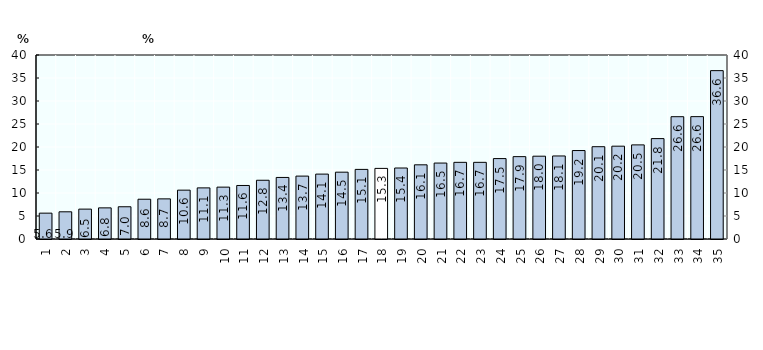
| Category |   2013 (or latest year) |
|---|---|
| 0 | 5.619 |
| 1 | 5.913 |
| 2 | 6.495 |
| 3 | 6.769 |
| 4 | 7.008 |
| 5 | 8.648 |
| 6 | 8.724 |
| 7 | 10.62 |
| 8 | 11.111 |
| 9 | 11.274 |
| 10 | 11.634 |
| 11 | 12.77 |
| 12 | 13.38 |
| 13 | 13.673 |
| 14 | 14.109 |
| 15 | 14.527 |
| 16 | 15.13 |
| 17 | 15.347 |
| 18 | 15.433 |
| 19 | 16.126 |
| 20 | 16.509 |
| 21 | 16.667 |
| 22 | 16.667 |
| 23 | 17.482 |
| 24 | 17.907 |
| 25 | 18 |
| 26 | 18.053 |
| 27 | 19.229 |
| 28 | 20.065 |
| 29 | 20.178 |
| 30 | 20.46 |
| 31 | 21.827 |
| 32 | 26.588 |
| 33 | 26.602 |
| 34 | 36.6 |